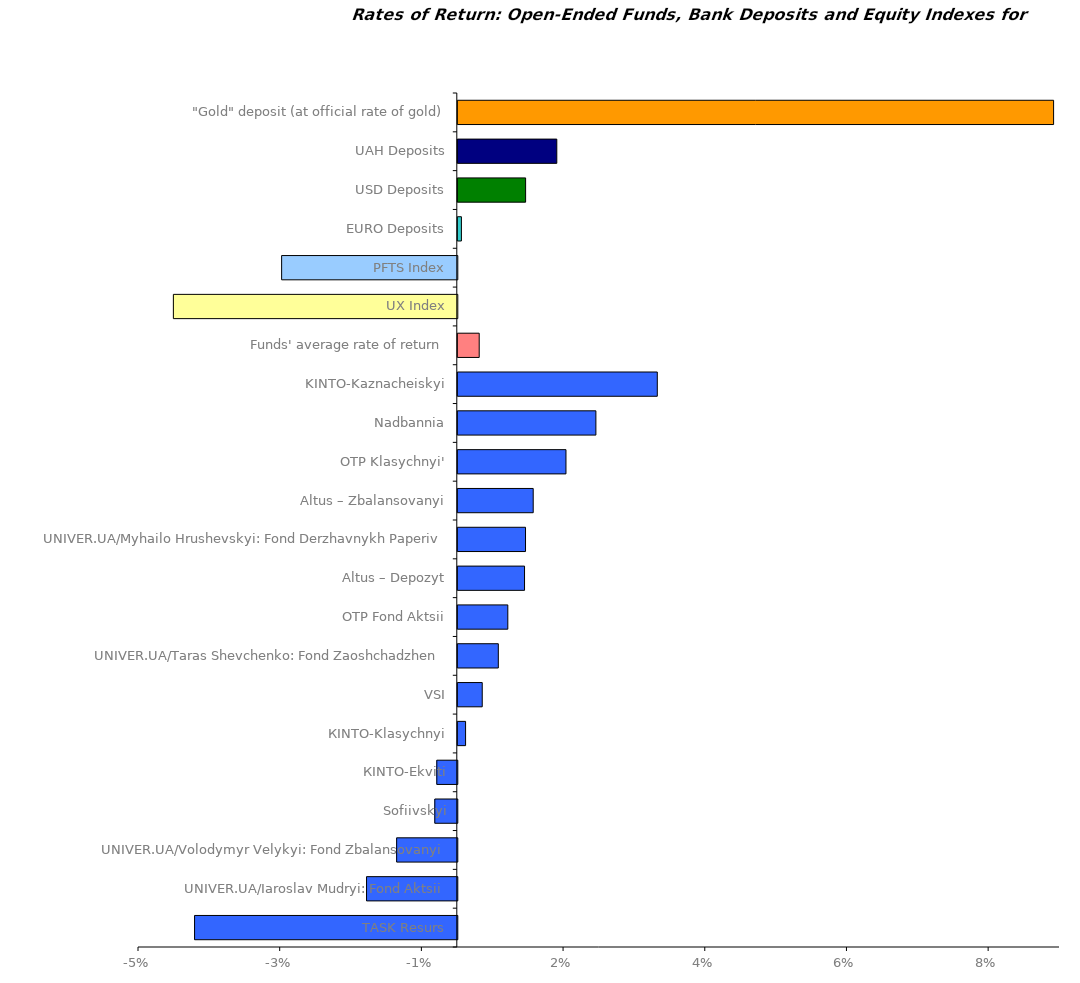
| Category | Series 0 |
|---|---|
| ТАSK Resurs | -0.037 |
| UNIVER.UA/Iaroslav Mudryi: Fond Aktsii | -0.013 |
| UNIVER.UA/Volodymyr Velykyi: Fond Zbalansovanyi | -0.009 |
| Sofiivskyi | -0.003 |
| КІNTO-Ekviti | -0.003 |
| КІNТО-Klasychnyi | 0.001 |
| VSI | 0.003 |
| UNIVER.UA/Taras Shevchenko: Fond Zaoshchadzhen | 0.006 |
| OTP Fond Aktsii | 0.007 |
| Altus – Depozyt | 0.009 |
| UNIVER.UA/Myhailo Hrushevskyi: Fond Derzhavnykh Paperiv | 0.01 |
| Altus – Zbalansovanyi | 0.011 |
| OTP Klasychnyi' | 0.015 |
| Nadbannia | 0.019 |
| KINTO-Kaznacheiskyi | 0.028 |
| Funds' average rate of return | 0.003 |
| UX Index | -0.04 |
| PFTS Index | -0.025 |
| EURO Deposits | 0.001 |
| USD Deposits | 0.01 |
| UAH Deposits | 0.014 |
| "Gold" deposit (at official rate of gold) | 0.084 |